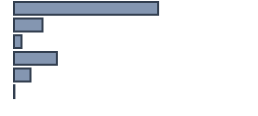
| Category | Percentatge |
|---|---|
| 0 | 60.043 |
| 1 | 11.87 |
| 2 | 3.174 |
| 3 | 17.87 |
| 4 | 6.87 |
| 5 | 0.174 |